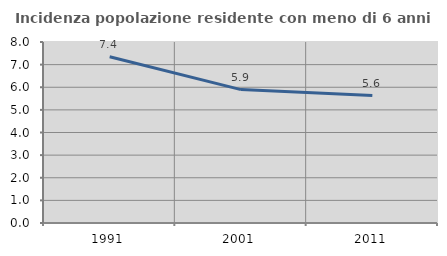
| Category | Incidenza popolazione residente con meno di 6 anni |
|---|---|
| 1991.0 | 7.351 |
| 2001.0 | 5.897 |
| 2011.0 | 5.633 |